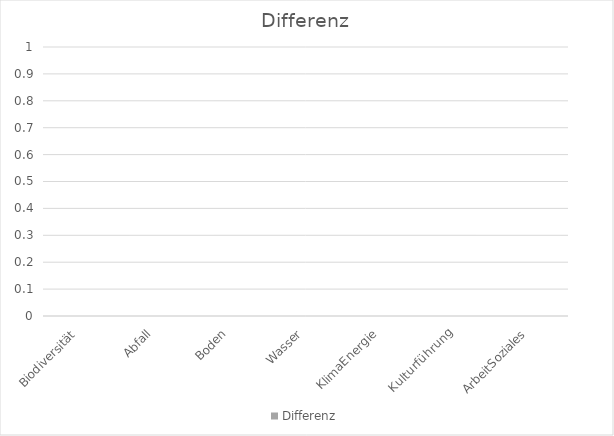
| Category | Differenz |
|---|---|
| Biodiversität | 0 |
| Abfall | 0 |
| Boden | 0 |
| Wasser | 0 |
| KlimaEnergie | 0 |
| Kulturführung | 0 |
| ArbeitSoziales | 0 |